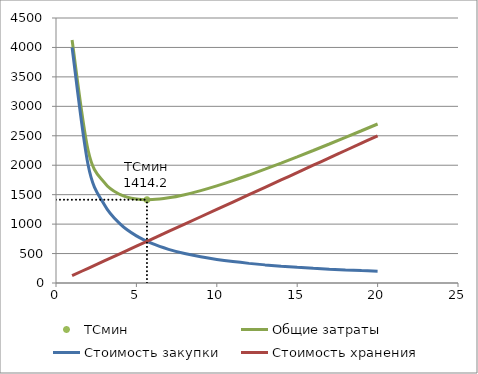
| Category | TСмин |
|---|---|
| 5.656854249492381 | 1414.214 |